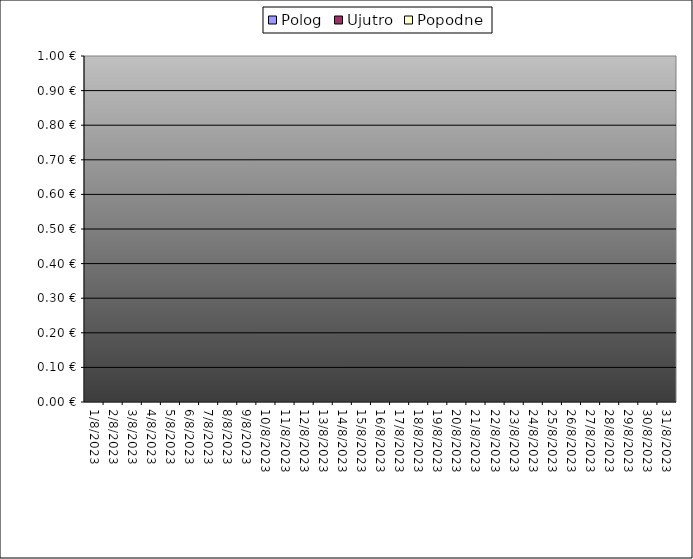
| Category | Polog | Ujutro | Popodne |
|---|---|---|---|
| 2023-08-01 |  | 0 | 0 |
| 2023-08-02 |  | 0 | 0 |
| 2023-08-03 |  | 0 | 0 |
| 2023-08-04 |  | 0 | 0 |
| 2023-08-05 |  | 0 | 0 |
| 2023-08-06 |  | 0 | 0 |
| 2023-08-07 |  | 0 | 0 |
| 2023-08-08 |  | 0 | 0 |
| 2023-08-09 |  | 0 | 0 |
| 2023-08-10 |  | 0 | 0 |
| 2023-08-11 |  | 0 | 0 |
| 2023-08-12 |  | 0 | 0 |
| 2023-08-13 |  | 0 | 0 |
| 2023-08-14 |  | 0 | 0 |
| 2023-08-15 |  | 0 | 0 |
| 2023-08-16 |  | 0 | 0 |
| 2023-08-17 |  | 0 | 0 |
| 2023-08-18 |  | 0 | 0 |
| 2023-08-19 |  | 0 | 0 |
| 2023-08-20 |  | 0 | 0 |
| 2023-08-21 |  | 0 | 0 |
| 2023-08-22 |  | 0 | 0 |
| 2023-08-23 |  | 0 | 0 |
| 2023-08-24 |  | 0 | 0 |
| 2023-08-25 |  | 0 | 0 |
| 2023-08-26 |  | 0 | 0 |
| 2023-08-27 |  | 0 | 0 |
| 2023-08-28 |  | 0 | 0 |
| 2023-08-29 |  | 0 | 0 |
| 2023-08-30 |  | 0 | 0 |
| 2023-08-31 |  | 0 | 0 |